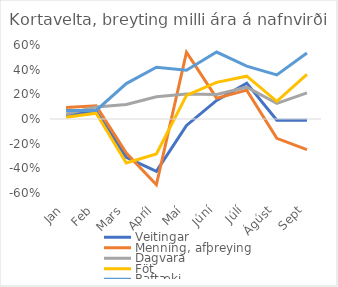
| Category | Veitingar | Menning, afþreying | Dagvara | Föt | Raftæki |
|---|---|---|---|---|---|
| Jan | 0.031 | 0.093 | 0.04 | 0.014 | 0.069 |
| Feb | 0.062 | 0.108 | 0.097 | 0.047 | 0.069 |
| Mars | -0.311 | -0.276 | 0.117 | -0.357 | 0.287 |
| Apríl | -0.424 | -0.533 | 0.18 | -0.284 | 0.42 |
| Maí | -0.052 | 0.541 | 0.202 | 0.192 | 0.395 |
| Júní | 0.151 | 0.169 | 0.199 | 0.297 | 0.543 |
| Júlí | 0.291 | 0.234 | 0.258 | 0.347 | 0.429 |
| Ágúst | -0.01 | -0.157 | 0.127 | 0.143 | 0.358 |
| Sept | -0.01 | -0.248 | 0.212 | 0.362 | 0.535 |